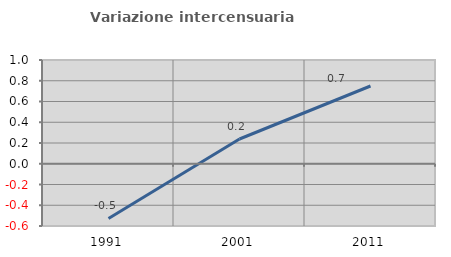
| Category | Variazione intercensuaria annua |
|---|---|
| 1991.0 | -0.527 |
| 2001.0 | 0.239 |
| 2011.0 | 0.749 |